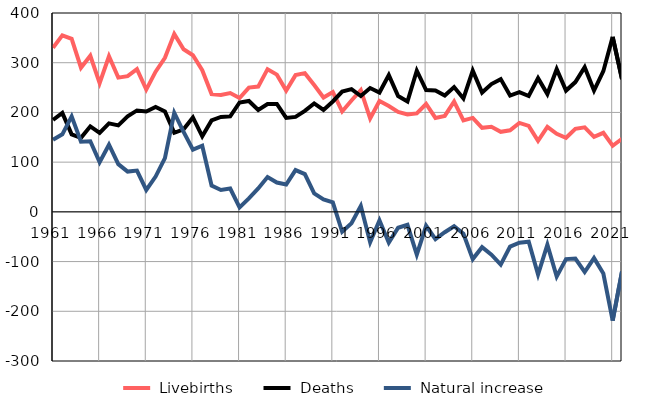
| Category |  Livebirths |  Deaths |  Natural increase |
|---|---|---|---|
| 1961.0 | 330 | 185 | 145 |
| 1962.0 | 355 | 199 | 156 |
| 1963.0 | 348 | 156 | 192 |
| 1964.0 | 290 | 149 | 141 |
| 1965.0 | 314 | 172 | 142 |
| 1966.0 | 259 | 159 | 100 |
| 1967.0 | 313 | 178 | 135 |
| 1968.0 | 270 | 174 | 96 |
| 1969.0 | 273 | 192 | 81 |
| 1970.0 | 287 | 204 | 83 |
| 1971.0 | 246 | 202 | 44 |
| 1972.0 | 282 | 211 | 71 |
| 1973.0 | 310 | 202 | 108 |
| 1974.0 | 358 | 159 | 199 |
| 1975.0 | 327 | 166 | 161 |
| 1976.0 | 315 | 190 | 125 |
| 1977.0 | 285 | 152 | 133 |
| 1978.0 | 237 | 184 | 53 |
| 1979.0 | 235 | 191 | 44 |
| 1980.0 | 239 | 192 | 47 |
| 1981.0 | 229 | 220 | 9 |
| 1982.0 | 250 | 223 | 27 |
| 1983.0 | 252 | 205 | 47 |
| 1984.0 | 287 | 217 | 70 |
| 1985.0 | 276 | 217 | 59 |
| 1986.0 | 244 | 189 | 55 |
| 1987.0 | 275 | 191 | 84 |
| 1988.0 | 279 | 203 | 76 |
| 1989.0 | 255 | 218 | 37 |
| 1990.0 | 230 | 205 | 25 |
| 1991.0 | 241 | 222 | 19 |
| 1992.0 | 202 | 242 | -40 |
| 1993.0 | 224 | 247 | -23 |
| 1994.0 | 245 | 233 | 12 |
| 1995.0 | 188 | 249 | -61 |
| 1996.0 | 223 | 240 | -17 |
| 1997.0 | 213 | 275 | -62 |
| 1998.0 | 201 | 233 | -32 |
| 1999.0 | 196 | 222 | -26 |
| 2000.0 | 198 | 284 | -86 |
| 2001.0 | 217 | 245 | -28 |
| 2002.0 | 189 | 244 | -55 |
| 2003.0 | 193 | 234 | -41 |
| 2004.0 | 222 | 251 | -29 |
| 2005.0 | 184 | 228 | -44 |
| 2006.0 | 189 | 284 | -95 |
| 2007.0 | 169 | 240 | -71 |
| 2008.0 | 171 | 257 | -86 |
| 2009.0 | 161 | 267 | -106 |
| 2010.0 | 164 | 234 | -70 |
| 2011.0 | 179 | 241 | -62 |
| 2012.0 | 173 | 233 | -60 |
| 2013.0 | 143 | 269 | -126 |
| 2014.0 | 171 | 237 | -66 |
| 2015.0 | 157 | 287 | -130 |
| 2016.0 | 149 | 244 | -95 |
| 2017.0 | 167 | 261 | -94 |
| 2018.0 | 170 | 291 | -121 |
| 2019.0 | 151 | 244 | -93 |
| 2020.0 | 159 | 283 | -124 |
| 2021.0 | 133 | 352 | -219 |
| 2022.0 | 147 | 267 | -120 |